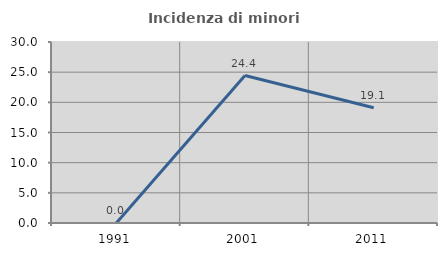
| Category | Incidenza di minori stranieri |
|---|---|
| 1991.0 | 0 |
| 2001.0 | 24.444 |
| 2011.0 | 19.101 |